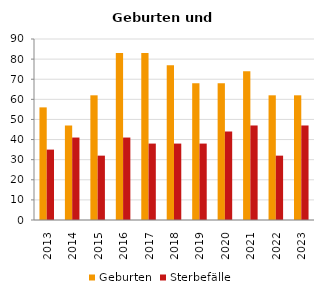
| Category | Geburten | Sterbefälle |
|---|---|---|
| 2013.0 | 56 | 35 |
| 2014.0 | 47 | 41 |
| 2015.0 | 62 | 32 |
| 2016.0 | 83 | 41 |
| 2017.0 | 83 | 38 |
| 2018.0 | 77 | 38 |
| 2019.0 | 68 | 38 |
| 2020.0 | 68 | 44 |
| 2021.0 | 74 | 47 |
| 2022.0 | 62 | 32 |
| 2023.0 | 62 | 47 |